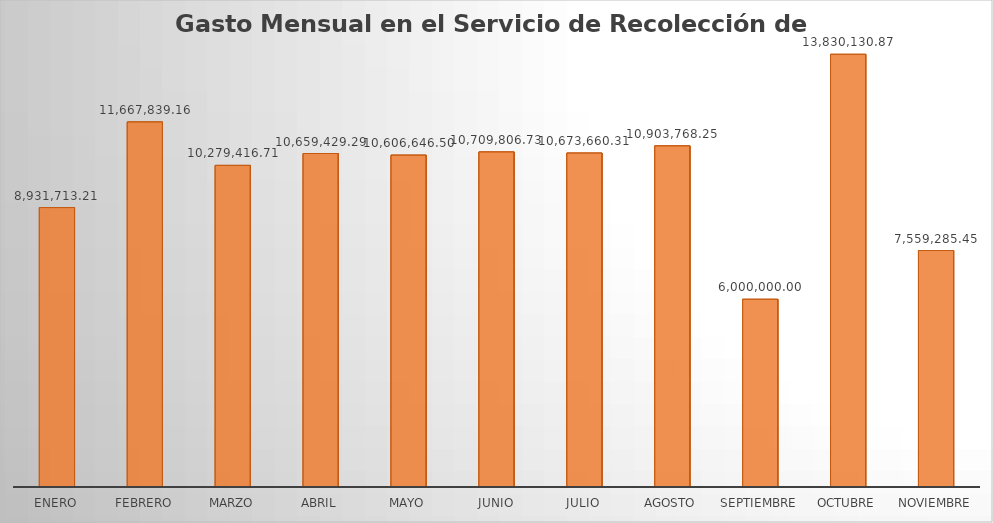
| Category | Monto |
|---|---|
| ENERO | 8931713.21 |
| FEBRERO | 11667839.16 |
| MARZO | 10279416.71 |
| ABRIL | 10659429.29 |
| MAYO | 10606646.5 |
| JUNIO | 10709806.73 |
| JULIO | 10673660.31 |
| AGOSTO | 10903768.25 |
| SEPTIEMBRE | 6000000 |
| OCTUBRE | 13830130.87 |
| NOVIEMBRE | 7559285.45 |